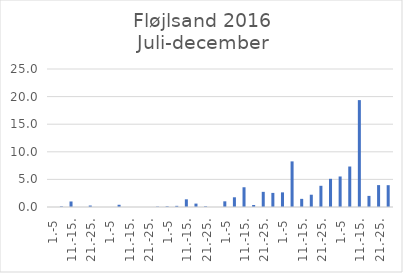
| Category | Series 0 |
|---|---|
| 1.-5 | 0 |
| 6.-10. | 0.116 |
| 11.-15. | 1 |
| 16.-20. | 0 |
| 21.-25. | 0.265 |
| 26.-31. | 0 |
| 1.-5 | 0 |
| 6.-10. | 0.404 |
| 11.-15. | 0 |
| 16.-20. | 0 |
| 21.-25. | 0 |
| 26.-31. | 0.074 |
| 1.-5 | 0.128 |
| 6.-10. | 0.209 |
| 11.-15. | 1.391 |
| 16.-20. | 0.616 |
| 21.-25. | 0.128 |
| 26.-30. | 0 |
| 1.-5 | 1.028 |
| 6.-10. | 1.759 |
| 11.-15. | 3.576 |
| 16.-20. | 0.364 |
| 21.-25. | 2.745 |
| 26.-31. | 2.554 |
| 1.-5 | 2.651 |
| 6.-10. | 8.263 |
| 11.-15. | 1.475 |
| 16.-20. | 2.225 |
| 21.-25. | 3.841 |
| 26.-30. | 5.106 |
| 1.-5 | 5.53 |
| 6.-10. | 7.333 |
| 11.-15. | 19.363 |
| 16.-20. | 2.011 |
| 21.-25. | 3.967 |
| 26.-31. | 3.953 |